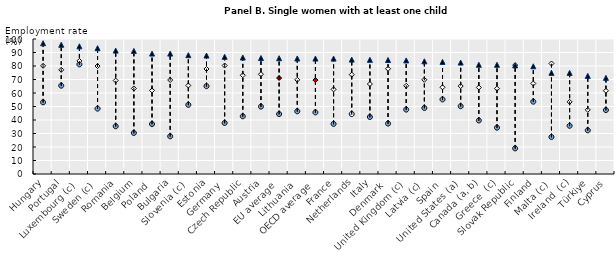
| Category | Low education | Medium education | High education |
|---|---|---|---|
| Hungary | 53.112 | 80.147 | 96.854 |
| Portugal | 65.422 | 77.158 | 95.725 |
| Luxembourg (c) | 81.205 | 83.784 | 94.585 |
| Sweden (c) | 48.429 | 79.964 | 93.205 |
| Romania | 35.392 | 69.215 | 91.417 |
| Belgium | 30.423 | 63.357 | 91.151 |
| Poland | 37.002 | 61.914 | 89.187 |
| Bulgaria | 27.926 | 69.648 | 89.168 |
| Slovenia (c) | 51.236 | 65.565 | 88.002 |
| Estonia | 65.092 | 77.807 | 87.734 |
| Germany | 37.818 | 80.338 | 86.79 |
| Czech Republic | 42.748 | 73.169 | 86.314 |
| Austria | 49.916 | 73.892 | 85.903 |
| EU average | 44.417 | 71.099 | 85.749 |
| Lithuania | 46.45 | 69.788 | 85.582 |
| OECD average | 45.642 | 69.551 | 85.5 |
| France | 37.126 | 62.684 | 85.481 |
| Netherlands | 44.413 | 73.62 | 84.742 |
| Italy | 42.254 | 66.669 | 84.57 |
| Denmark | 37.357 | 77.954 | 84.423 |
| United Kingdom (c) | 47.724 | 65.356 | 84.135 |
| Latvia (c) | 48.902 | 69.819 | 83.474 |
| Spain | 55.253 | 64.234 | 83.048 |
| United States (a) | 50.2 | 65.139 | 82.523 |
| Canada (a, b) | 39.659 | 64.092 | 80.903 |
| Greece  (c) | 34.3 | 63.235 | 80.884 |
| Slovak Republic | 18.984 | 80.649 | 80.446 |
| Finland | 53.59 | 67.027 | 79.782 |
| Malta (c) | 27.404 | 81.859 | 74.917 |
| Ireland  (c) | 35.725 | 53.449 | 74.885 |
| Türkiye | 32.359 | 47.505 | 72.662 |
| Cyprus | 47.367 | 61.642 | 71.216 |